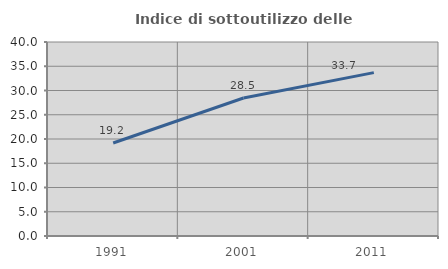
| Category | Indice di sottoutilizzo delle abitazioni  |
|---|---|
| 1991.0 | 19.174 |
| 2001.0 | 28.45 |
| 2011.0 | 33.69 |